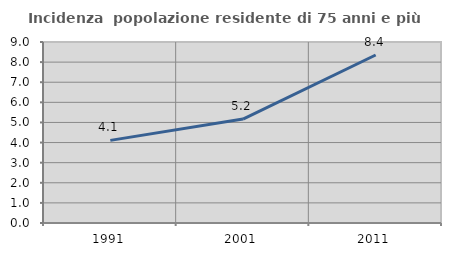
| Category | Incidenza  popolazione residente di 75 anni e più |
|---|---|
| 1991.0 | 4.108 |
| 2001.0 | 5.168 |
| 2011.0 | 8.353 |